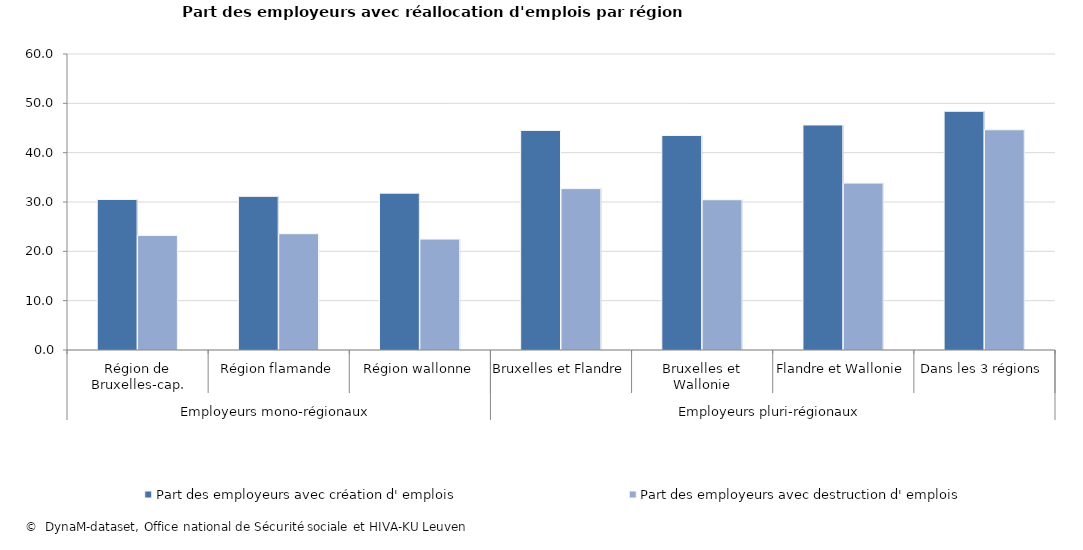
| Category | Part des employeurs avec création d' emplois | Part des employeurs avec destruction d' emplois |
|---|---|---|
| 0 | 30.517 | 23.22 |
| 1 | 31.149 | 23.572 |
| 2 | 31.79 | 22.487 |
| 3 | 44.516 | 32.713 |
| 4 | 43.486 | 30.459 |
| 5 | 45.614 | 33.835 |
| 6 | 48.387 | 44.645 |